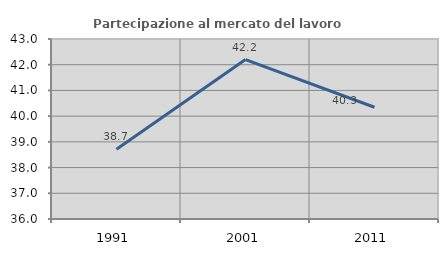
| Category | Partecipazione al mercato del lavoro  femminile |
|---|---|
| 1991.0 | 38.713 |
| 2001.0 | 42.201 |
| 2011.0 | 40.346 |